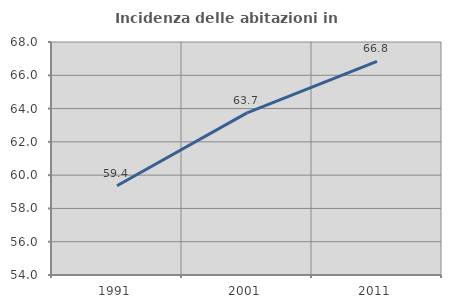
| Category | Incidenza delle abitazioni in proprietà  |
|---|---|
| 1991.0 | 59.363 |
| 2001.0 | 63.744 |
| 2011.0 | 66.841 |